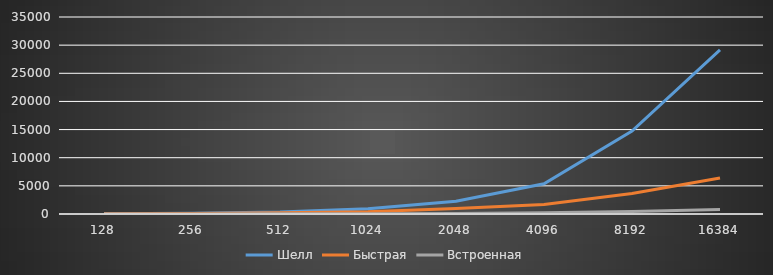
| Category | Шелл | Быстрая | Встроенная |
|---|---|---|---|
| 128.0 | 59 | 49 | 19.333 |
| 256.0 | 130.333 | 81.333 | 10.667 |
| 512.0 | 355.667 | 224.667 | 25 |
| 1024.0 | 941.667 | 385 | 53 |
| 2048.0 | 2269 | 956 | 100.333 |
| 4096.0 | 5378.333 | 1701.333 | 214.333 |
| 8192.0 | 14726.667 | 3632 | 455 |
| 16384.0 | 29165.667 | 6390 | 793.333 |